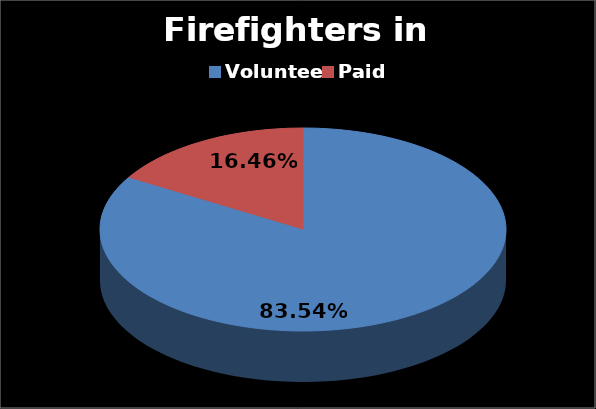
| Category | Series 0 |
|---|---|
| Volunteer | 0.835 |
| Paid | 0.165 |